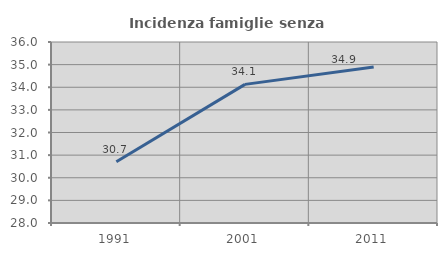
| Category | Incidenza famiglie senza nuclei |
|---|---|
| 1991.0 | 30.704 |
| 2001.0 | 34.127 |
| 2011.0 | 34.898 |